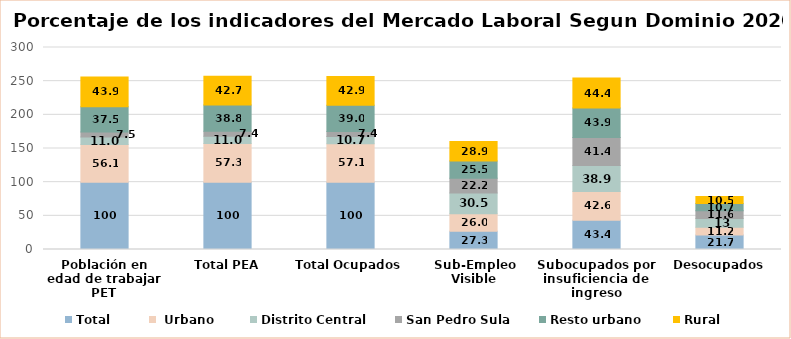
| Category | Total |  Urbano | Distrito Central | San Pedro Sula | Resto urbano | Rural |
|---|---|---|---|---|---|---|
| Población en edad de trabajar PET | 100 | 56.059 | 11.019 | 7.536 | 37.504 | 43.941 |
| Total PEA | 100 | 57.27 | 10.997 | 7.423 | 38.849 | 42.73 |
| Total Ocupados | 100 | 57.068 | 10.74 | 7.368 | 38.96 | 42.932 |
| Sub-Empleo Visible | 27.261 | 26.002 | 30.5 | 22.153 | 25.49 | 28.934 |
| Subocupados por insuficiencia de ingreso | 43.384 | 42.604 | 38.912 | 41.389 | 43.851 | 44.421 |
| Desocupados | 21.7 | 11.2 | 13 | 11.6 | 10.7 | 10.5 |